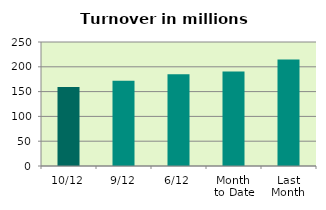
| Category | Series 0 |
|---|---|
| 10/12 | 159.087 |
| 9/12 | 171.991 |
| 6/12 | 185.007 |
| Month 
to Date | 190.491 |
| Last
Month | 214.794 |